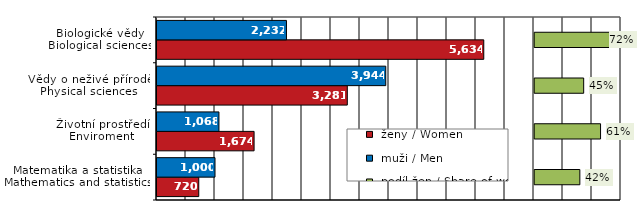
| Category |  ženy / Women |  muži / Men |
|---|---|---|
| Matematika a statistika
Mathematics and statistics | 720 | 1000 |
| Životní prostředí
Enviroment | 1674 | 1068 |
| Vědy o neživé přírodě
Physical sciences | 3281 | 3944 |
| Biologické vědy
Biological sciences | 5634 | 2232 |